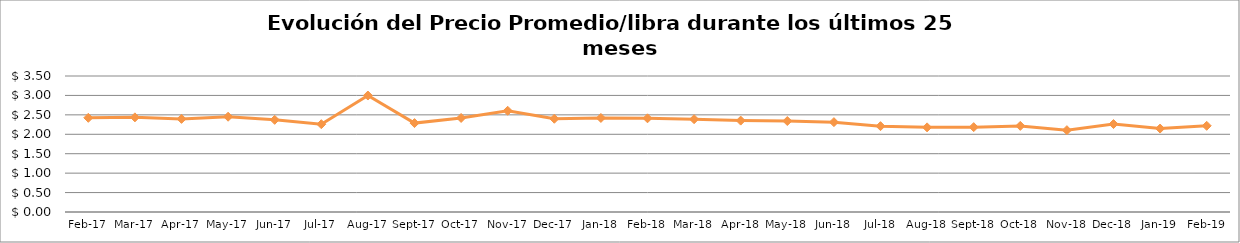
| Category | Series 0 |
|---|---|
| 2017-02-01 | 2.424 |
| 2017-03-01 | 2.436 |
| 2017-04-01 | 2.396 |
| 2017-05-01 | 2.452 |
| 2017-06-01 | 2.372 |
| 2017-07-01 | 2.26 |
| 2017-08-01 | 2.997 |
| 2017-09-01 | 2.288 |
| 2017-10-01 | 2.421 |
| 2017-11-01 | 2.605 |
| 2017-12-01 | 2.4 |
| 2018-01-01 | 2.42 |
| 2018-02-01 | 2.412 |
| 2018-03-01 | 2.388 |
| 2018-04-01 | 2.352 |
| 2018-05-01 | 2.341 |
| 2018-06-01 | 2.312 |
| 2018-07-01 | 2.209 |
| 2018-08-01 | 2.178 |
| 2018-09-01 | 2.184 |
| 2018-10-01 | 2.216 |
| 2018-11-01 | 2.106 |
| 2018-12-01 | 2.264 |
| 2019-01-01 | 2.147 |
| 2019-02-01 | 2.218 |